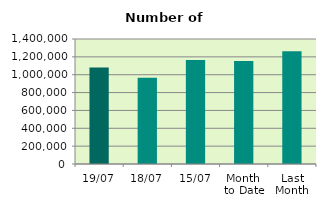
| Category | Series 0 |
|---|---|
| 19/07 | 1081980 |
| 18/07 | 965994 |
| 15/07 | 1164774 |
| Month 
to Date | 1152790.462 |
| Last
Month | 1263143.455 |